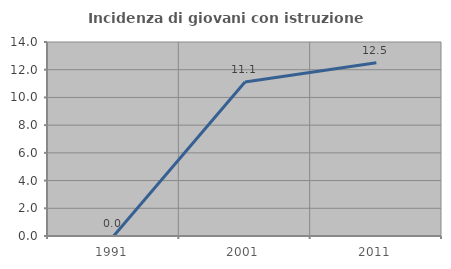
| Category | Incidenza di giovani con istruzione universitaria |
|---|---|
| 1991.0 | 0 |
| 2001.0 | 11.111 |
| 2011.0 | 12.5 |